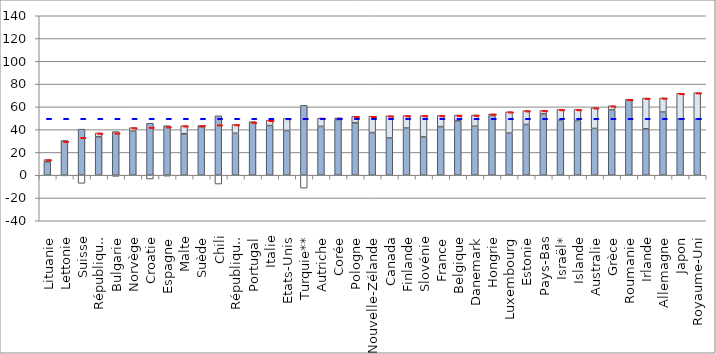
| Category | Revenus brut | Impôts nets | Transferts nets |
|---|---|---|---|
| Lituanie | 11.729 | 0 | 1.964 |
| Lettonie | 30.48 | -0.596 | 0 |
| Suisse | 40.417 | -7.133 | 0 |
| République slovaque | 33.831 | 0 | 3.206 |
| Bulgarie | 38.275 | -1.05 | 0 |
| Norvège | 38.668 | 0 | 3.11 |
| Croatie | 45.576 | -3.366 | 0 |
| Espagne | 43.454 | -0.849 | 0 |
| Malte | 36.353 | 0 | 7.075 |
| Suède | 42.414 | 0 | 1.237 |
| Chili | 52.159 | -7.773 | 0 |
| République tchèque | 36.793 | 0 | 7.71 |
| Portugal | 47.026 | -0.389 | 0 |
| Italie | 43.581 | 0 | 4.679 |
| Etats-Unis | 39.273 | 0 | 10.596 |
| Turquie** | 61.339 | -11.355 | 0 |
| Autriche | 42.856 | 0 | 7.268 |
| Corée | 48.851 | 0 | 1.369 |
| Pologne | 46.081 | 0 | 5.542 |
| Nouvelle-Zélande | 37.438 | 0 | 14.293 |
| Canada | 32.67 | 0 | 19.491 |
| Finlande | 41.413 | 0 | 10.957 |
| Slovénie | 33.632 | 0 | 18.79 |
| France | 42.699 | 0 | 9.763 |
| Belgique | 47.857 | 0 | 4.885 |
| Danemark | 42.974 | 0 | 9.863 |
| Hongrie | 52.595 | 0 | 1.186 |
| Luxembourg | 36.929 | 0 | 18.767 |
| Estonie | 44.541 | 0 | 12.132 |
| Pays-Bas | 53.841 | 0 | 3.054 |
| Israël* | 48.166 | 0 | 9.567 |
| Islande | 48.052 | 0 | 9.732 |
| Australie | 41.044 | 0 | 18.208 |
| Grèce | 57.26 | 0 | 3.633 |
| Roumanie | 65.752 | 0 | 0.823 |
| Irlande | 40.723 | 0 | 26.951 |
| Allemagne | 55.466 | 0 | 12.362 |
| Japon | 49.515 | 0 | 22.38 |
| Royaume-Uni | 49.204 | 0 | 23.253 |